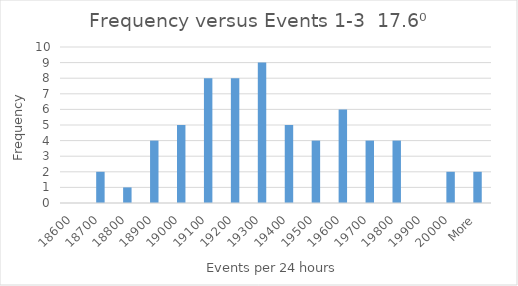
| Category | Series 0 |
|---|---|
| 18600 | 0 |
| 18700 | 2 |
| 18800 | 1 |
| 18900 | 4 |
| 19000 | 5 |
| 19100 | 8 |
| 19200 | 8 |
| 19300 | 9 |
| 19400 | 5 |
| 19500 | 4 |
| 19600 | 6 |
| 19700 | 4 |
| 19800 | 4 |
| 19900 | 0 |
| 20000 | 2 |
| More | 2 |